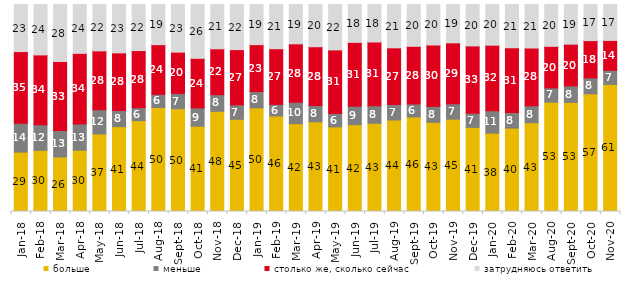
| Category | больше | меньше | столько же, сколько сейчас | затрудняюсь ответить |
|---|---|---|---|---|
| 2018-01-01 | 28.7 | 13.9 | 34.65 | 22.75 |
| 2018-02-01 | 29.55 | 12.4 | 33.7 | 24.35 |
| 2018-03-01 | 26.35 | 12.75 | 33.35 | 27.55 |
| 2018-04-01 | 29.6 | 12.7 | 34.1 | 23.6 |
| 2018-05-01 | 37.45 | 11.7 | 28.45 | 22.4 |
| 2018-06-01 | 41 | 7.8 | 27.85 | 23.35 |
| 2018-07-01 | 43.9 | 6.25 | 27.6 | 22.25 |
| 2018-08-01 | 50.25 | 6.35 | 24 | 19.4 |
| 2018-09-01 | 49.65 | 7.35 | 19.95 | 23 |
| 2018-10-01 | 41.2 | 8.85 | 23.95 | 26 |
| 2018-11-01 | 48.403 | 8.034 | 22.156 | 21.407 |
| 2018-12-01 | 44.55 | 6.95 | 26.7 | 21.8 |
| 2019-01-01 | 50.1 | 7.85 | 22.65 | 19.4 |
| 2019-02-01 | 46.15 | 5.6 | 26.9 | 21.35 |
| 2019-03-01 | 42.417 | 10.343 | 28.245 | 18.996 |
| 2019-04-01 | 43.317 | 7.871 | 28.416 | 20.396 |
| 2019-05-01 | 40.862 | 6.439 | 30.758 | 21.942 |
| 2019-06-01 | 41.945 | 8.878 | 30.873 | 18.304 |
| 2019-07-01 | 42.624 | 8.465 | 30.792 | 18.119 |
| 2019-08-01 | 44.206 | 7.493 | 27.373 | 20.929 |
| 2019-09-01 | 45.693 | 6.287 | 27.822 | 20.198 |
| 2019-10-01 | 43.069 | 7.723 | 29.653 | 19.554 |
| 2019-11-01 | 44.604 | 7.426 | 29.455 | 18.515 |
| 2019-12-01 | 40.644 | 6.782 | 32.574 | 20 |
| 2020-01-01 | 37.871 | 10.842 | 31.634 | 19.653 |
| 2020-02-01 | 40.297 | 7.525 | 31.287 | 20.891 |
| 2020-03-01 | 42.885 | 8.18 | 27.913 | 21.021 |
| 2020-08-01 | 52.83 | 6.902 | 20.06 | 20.209 |
| 2020-09-01 | 52.713 | 7.964 | 20.159 | 19.164 |
| 2020-10-01 | 56.851 | 7.673 | 18.037 | 17.439 |
| 2020-11-01 | 61.4 | 6.8 | 14.45 | 17.35 |